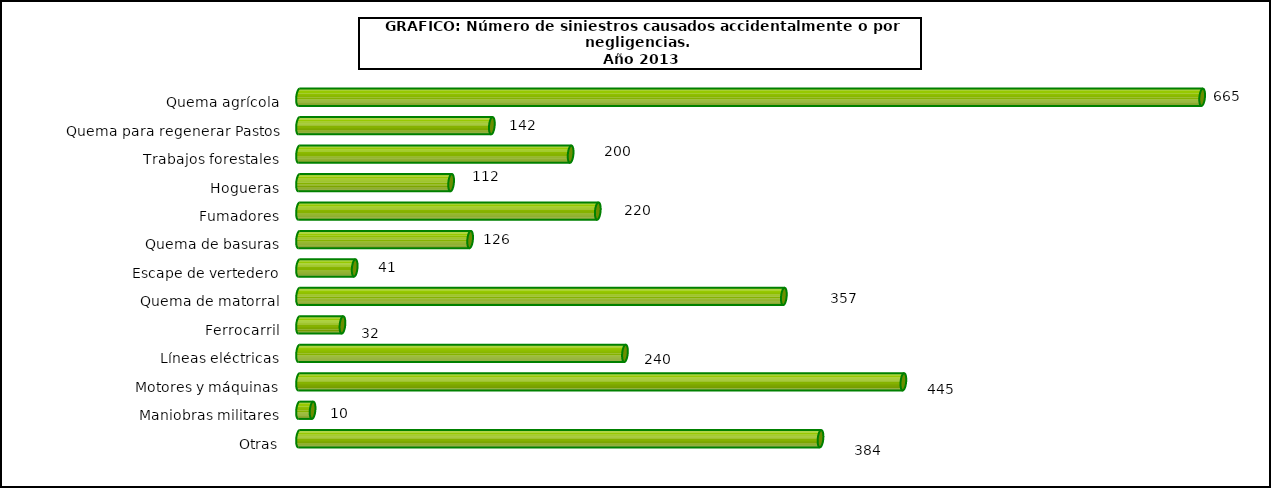
| Category | neglicencias |
|---|---|
| Quema agrícola | 665 |
| Quema para regenerar Pastos | 142 |
| Trabajos forestales | 200 |
| Hogueras | 112 |
| Fumadores | 220 |
| Quema de basuras | 126 |
| Escape de vertedero | 41 |
| Quema de matorral | 357 |
| Ferrocarril | 32 |
| Líneas eléctricas | 240 |
| Motores y máquinas | 445 |
| Maniobras militares | 10 |
| Otras | 384 |